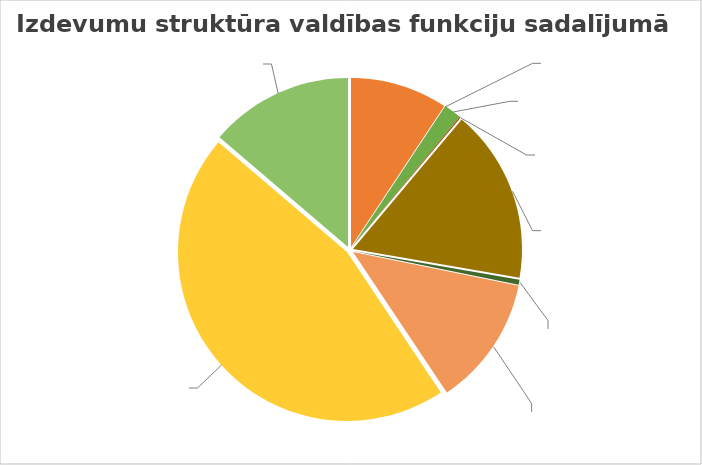
| Category | Series 0 |
|---|---|
| Vispārējie valdības dienesti | 4063382 |
| Sabiedriskā kārtība un drošība | 368 |
| Ekonomiskā darbība | 741370 |
| Vides aizsardzība | 49277 |
| Teritoriju un mājokļu apsaimniekošana | 7240131 |
| Veselība | 218414 |
| Atpūta, kultūra un reliģija | 5421247 |
| Izglītība | 19908972 |
| Sociālā aizsardzība | 6001874 |